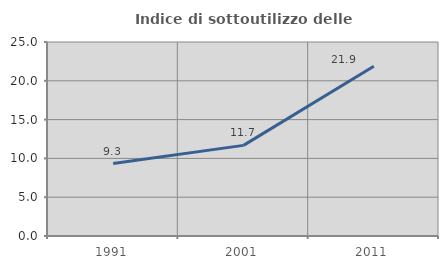
| Category | Indice di sottoutilizzo delle abitazioni  |
|---|---|
| 1991.0 | 9.341 |
| 2001.0 | 11.677 |
| 2011.0 | 21.879 |